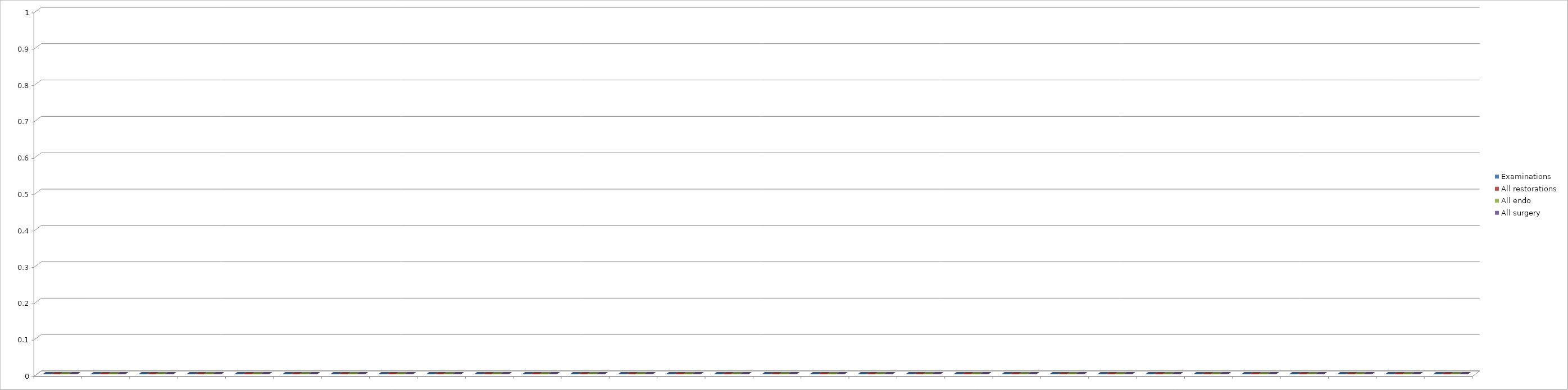
| Category | Examinations | All restorations | All endo | All surgery |
|---|---|---|---|---|
| 0 | 0 | 0 | 0 | 0 |
| 1 | 0 | 0 | 0 | 0 |
| 2 | 0 | 0 | 0 | 0 |
| 3 | 0 | 0 | 0 | 0 |
| 4 | 0 | 0 | 0 | 0 |
| 5 | 0 | 0 | 0 | 0 |
| 6 | 0 | 0 | 0 | 0 |
| 7 | 0 | 0 | 0 | 0 |
| 8 | 0 | 0 | 0 | 0 |
| 9 | 0 | 0 | 0 | 0 |
| 10 | 0 | 0 | 0 | 0 |
| 11 | 0 | 0 | 0 | 0 |
| 12 | 0 | 0 | 0 | 0 |
| 13 | 0 | 0 | 0 | 0 |
| 14 | 0 | 0 | 0 | 0 |
| 15 | 0 | 0 | 0 | 0 |
| 16 | 0 | 0 | 0 | 0 |
| 17 | 0 | 0 | 0 | 0 |
| 18 | 0 | 0 | 0 | 0 |
| 19 | 0 | 0 | 0 | 0 |
| 20 | 0 | 0 | 0 | 0 |
| 21 | 0 | 0 | 0 | 0 |
| 22 | 0 | 0 | 0 | 0 |
| 23 | 0 | 0 | 0 | 0 |
| 24 | 0 | 0 | 0 | 0 |
| 25 | 0 | 0 | 0 | 0 |
| 26 | 0 | 0 | 0 | 0 |
| 27 | 0 | 0 | 0 | 0 |
| 28 | 0 | 0 | 0 | 0 |
| 29 | 0 | 0 | 0 | 0 |